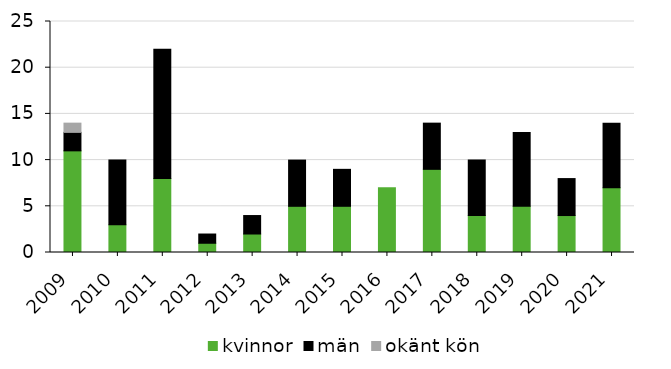
| Category | kvinnor | män | okänt kön |
|---|---|---|---|
| 2009 | 11 | 2 | 1 |
| 2010 | 3 | 7 | 0 |
| 2011 | 8 | 14 | 0 |
| 2012 | 1 | 1 | 0 |
| 2013 | 2 | 2 | 0 |
| 2014 | 5 | 5 | 0 |
| 2015 | 5 | 4 | 0 |
| 2016 | 7 | 0 | 0 |
| 2017 | 9 | 5 | 0 |
| 2018 | 4 | 6 | 0 |
| 2019 | 5 | 8 | 0 |
| 2020 | 4 | 4 | 0 |
| 2021 | 7 | 7 | 0 |